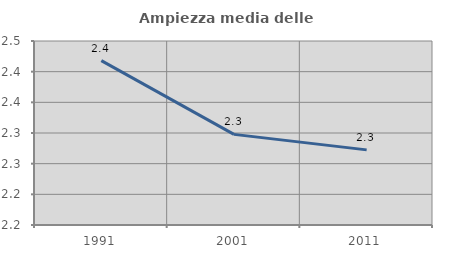
| Category | Ampiezza media delle famiglie |
|---|---|
| 1991.0 | 2.418 |
| 2001.0 | 2.298 |
| 2011.0 | 2.272 |